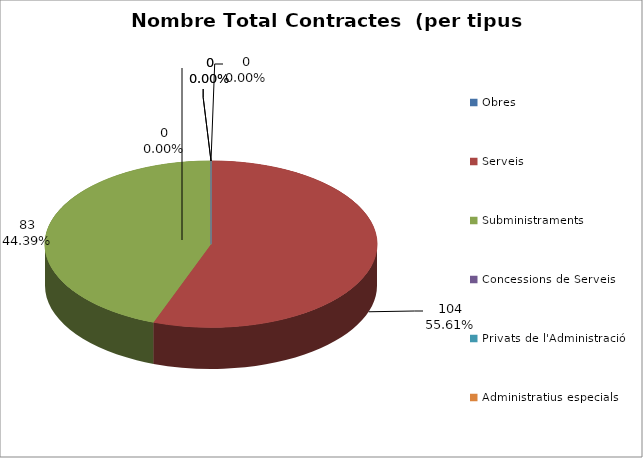
| Category | Nombre Total Contractes |
|---|---|
| Obres | 0 |
| Serveis | 104 |
| Subministraments | 83 |
| Concessions de Serveis | 0 |
| Privats de l'Administració | 0 |
| Administratius especials | 0 |